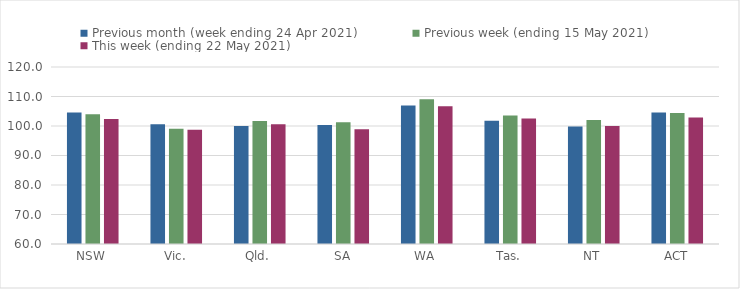
| Category | Previous month (week ending 24 Apr 2021) | Previous week (ending 15 May 2021) | This week (ending 22 May 2021) |
|---|---|---|---|
| NSW | 104.57 | 103.99 | 102.39 |
| Vic. | 100.63 | 99.06 | 98.76 |
| Qld. | 99.99 | 101.7 | 100.61 |
| SA | 100.33 | 101.25 | 98.93 |
| WA | 106.98 | 109.09 | 106.67 |
| Tas. | 101.8 | 103.52 | 102.54 |
| NT | 99.86 | 102.03 | 100.02 |
| ACT | 104.57 | 104.43 | 102.85 |